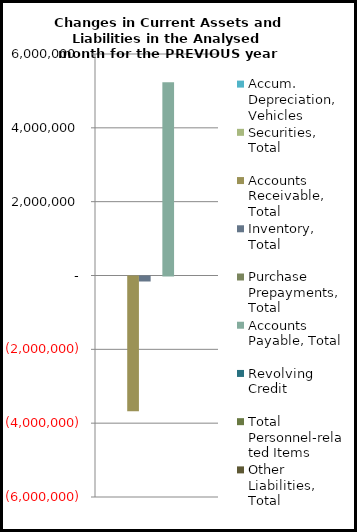
| Category | Accum. Depreciation, Vehicles | Securities, Total | Accounts Receivable, Total | Inventory, Total | Purchase Prepayments, Total | Accounts Payable, Total | Revolving Credit | Total Personnel-related Items | Other Liabilities, Total |
|---|---|---|---|---|---|---|---|---|---|
| 0 | 0 | 0 | -3648760.49 | -135332.84 | 0 | 5233661.7 | 0 | 0 | 0 |